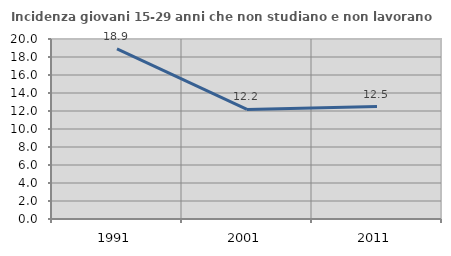
| Category | Incidenza giovani 15-29 anni che non studiano e non lavorano  |
|---|---|
| 1991.0 | 18.913 |
| 2001.0 | 12.17 |
| 2011.0 | 12.5 |